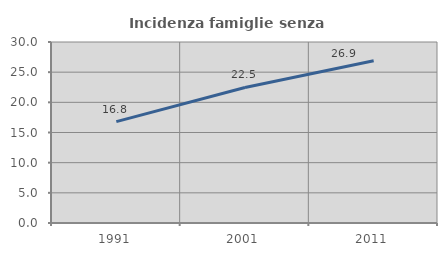
| Category | Incidenza famiglie senza nuclei |
|---|---|
| 1991.0 | 16.806 |
| 2001.0 | 22.467 |
| 2011.0 | 26.895 |